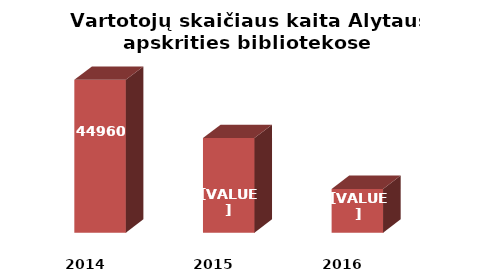
| Category | Series 0 |
|---|---|
| 2014.0 | 44960 |
| 2015.0 | 43641 |
| 2016.0 | 42490 |